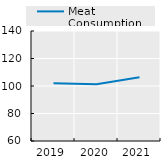
| Category | Meat Consumption |
|---|---|
| 2019.0 | 102.044 |
| 2020.0 | 101.298 |
| 2021.0 | 106.378 |